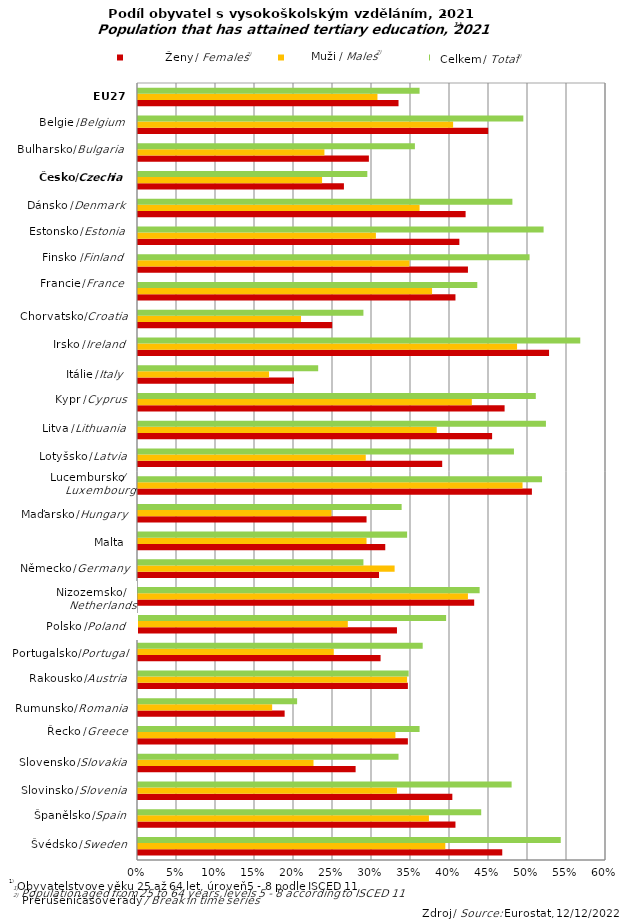
| Category | Celkem / Total | Muži / Males | Ženy / Females |
|---|---|---|---|
| Sweden | 0.467 | 0.394 | 0.542 |
| Spain | 0.407 | 0.373 | 0.44 |
| Slovenia | 0.403 | 0.332 | 0.479 |
| Slovakia | 0.279 | 0.225 | 0.334 |
| Greece | 0.346 | 0.33 | 0.361 |
| Romania | 0.188 | 0.172 | 0.204 |
| Austria | 0.346 | 0.345 | 0.347 |
| Portugal | 0.311 | 0.251 | 0.365 |
| Poland | 0.332 | 0.269 | 0.395 |
| Netherlands | 0.431 | 0.423 | 0.438 |
| Germany | 0.309 | 0.329 | 0.289 |
| Malta | 0.317 | 0.293 | 0.345 |
| Hungary | 0.293 | 0.248 | 0.338 |
| Luxembourg | 0.505 | 0.493 | 0.518 |
| Latvia | 0.39 | 0.292 | 0.482 |
| Lithuania | 0.454 | 0.383 | 0.523 |
| Cyprus | 0.47 | 0.428 | 0.51 |
| Italy | 0.2 | 0.168 | 0.231 |
| Ireland | 0.527 | 0.486 | 0.567 |
| Croatia | 0.249 | 0.209 | 0.289 |
| France | 0.407 | 0.377 | 0.435 |
| Finland | 0.423 | 0.348 | 0.502 |
| Estonia | 0.412 | 0.305 | 0.52 |
| Denmark | 0.42 | 0.361 | 0.48 |
| Czechia | 0.264 | 0.236 | 0.294 |
| Bulgaria | 0.296 | 0.239 | 0.355 |
| Belgium | 0.449 | 0.404 | 0.494 |
| EU 27 | 0.334 | 0.307 | 0.361 |